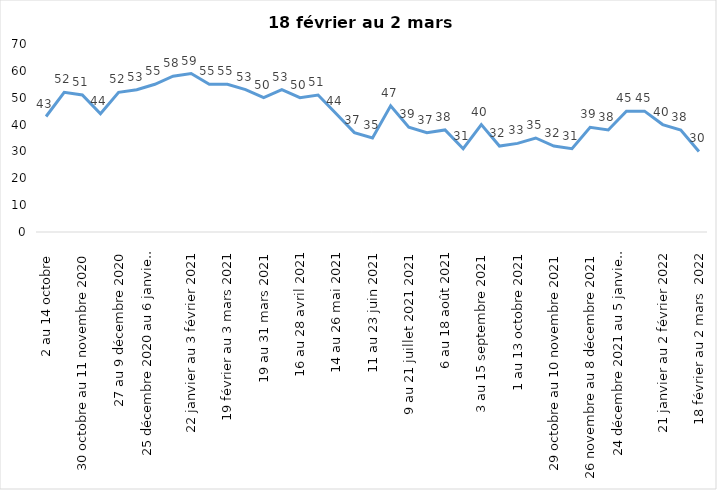
| Category | Toujours aux trois mesures |
|---|---|
| 2 au 14 octobre  | 43 |
| 16 au 28 octobre 2020 | 52 |
| 30 octobre au 11 novembre 2020 | 51 |
| 13 au 25 novembre 2020 | 44 |
| 27 au 9 décembre 2020 | 52 |
| 11 au 25 décembre 2020 | 53 |
| 25 décembre 2020 au 6 janvier 2021 | 55 |
| 8 au 20 janvier 2021 | 58 |
| 22 janvier au 3 février 2021 | 59 |
| 5 au 17 février 2021 | 55 |
| 19 février au 3 mars 2021 | 55 |
| 5 au 17 mars 2021 | 53 |
| 19 au 31 mars 2021 | 50 |
| 2 au 14 avril 2021 | 53 |
| 16 au 28 avril 2021 | 50 |
| 30 avril au 12 mai 2021 | 51 |
| 14 au 26 mai 2021 | 44 |
| 28 mai au 9 juin 2021 | 37 |
| 11 au 23 juin 2021 | 35 |
| 25 juin au 7 juillet 2021 | 47 |
| 9 au 21 juillet 2021 2021 | 39 |
| 23 au 4 août 2021 | 37 |
| 6 au 18 août 2021 | 38 |
| 20 août au 1er septembre 2021 | 31 |
| 3 au 15 septembre 2021 | 40 |
| 17 au 29 septembre 2021 | 32 |
| 1 au 13 octobre 2021 | 33 |
| 15 au 27 octobre 2021 | 35 |
| 29 octobre au 10 novembre 2021 | 32 |
| 12 au 24 novembre 2021 | 31 |
| 26 novembre au 8 décembre 2021 | 39 |
| 10 au 22 décembre 2021 | 38 |
| 24 décembre 2021 au 5 janvier 2022 2022 | 45 |
| 7 au 19 janvier 2022 | 45 |
| 21 janvier au 2 février 2022 | 40 |
| 4 au 16 février 2022 | 38 |
| 18 février au 2 mars  2022 | 30 |